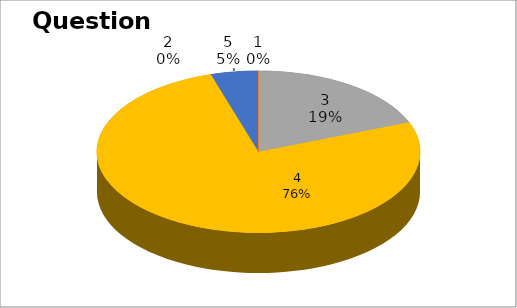
| Category | Series 0 |
|---|---|
| 0 | 0 |
| 1 | 0 |
| 2 | 4 |
| 3 | 16 |
| 4 | 1 |